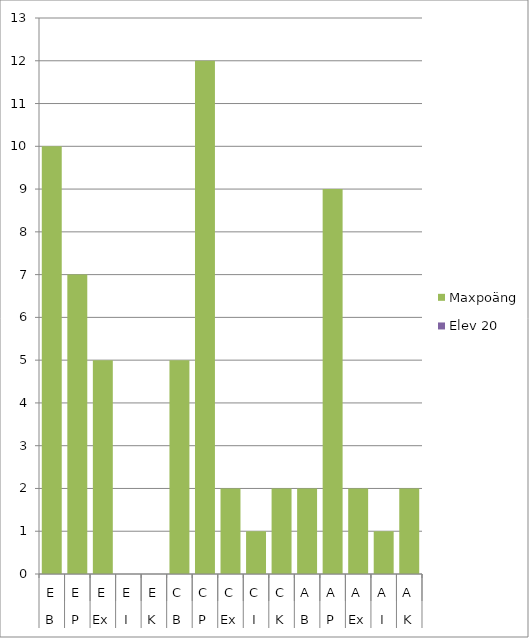
| Category | Maxpoäng | Elev 20 |
|---|---|---|
| 0 | 10 | 0 |
| 1 | 7 | 0 |
| 2 | 5 | 0 |
| 3 | 0 | 0 |
| 4 | 0 | 0 |
| 5 | 5 | 0 |
| 6 | 12 | 0 |
| 7 | 2 | 0 |
| 8 | 1 | 0 |
| 9 | 2 | 0 |
| 10 | 2 | 0 |
| 11 | 9 | 0 |
| 12 | 2 | 0 |
| 13 | 1 | 0 |
| 14 | 2 | 0 |